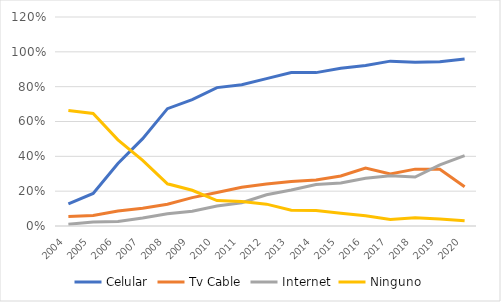
| Category | Celular | Tv Cable | Internet | Ninguno |
|---|---|---|---|---|
| 2004.0 | 0.127 | 0.055 | 0.01 | 0.663 |
| 2005.0 | 0.187 | 0.06 | 0.022 | 0.646 |
| 2006.0 | 0.359 | 0.086 | 0.026 | 0.494 |
| 2007.0 | 0.502 | 0.102 | 0.045 | 0.377 |
| 2008.0 | 0.674 | 0.125 | 0.071 | 0.242 |
| 2009.0 | 0.725 | 0.163 | 0.085 | 0.205 |
| 2010.0 | 0.795 | 0.192 | 0.115 | 0.146 |
| 2011.0 | 0.811 | 0.223 | 0.133 | 0.141 |
| 2012.0 | 0.846 | 0.242 | 0.179 | 0.125 |
| 2013.0 | 0.882 | 0.256 | 0.207 | 0.09 |
| 2014.0 | 0.881 | 0.265 | 0.239 | 0.089 |
| 2015.0 | 0.906 | 0.287 | 0.247 | 0.073 |
| 2016.0 | 0.921 | 0.333 | 0.274 | 0.059 |
| 2017.0 | 0.947 | 0.299 | 0.288 | 0.038 |
| 2018.0 | 0.94 | 0.326 | 0.281 | 0.047 |
| 2019.0 | 0.943 | 0.326 | 0.351 | 0.041 |
| 2020.0 | 0.959 | 0.225 | 0.404 | 0.03 |